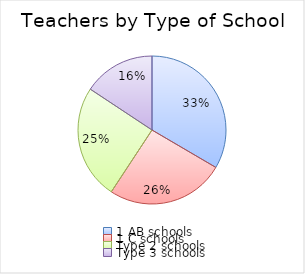
| Category | Series 0 |
|---|---|
| 1 AB schools | 82701 |
| 1 C schools | 63876 |
| Type 2 schools | 61936 |
| Type 3 schools | 38821 |